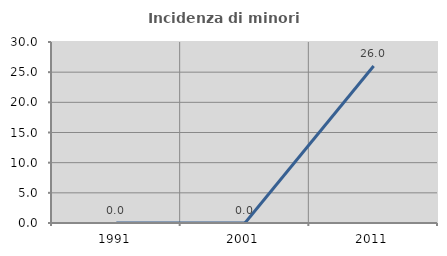
| Category | Incidenza di minori stranieri |
|---|---|
| 1991.0 | 0 |
| 2001.0 | 0 |
| 2011.0 | 26.016 |